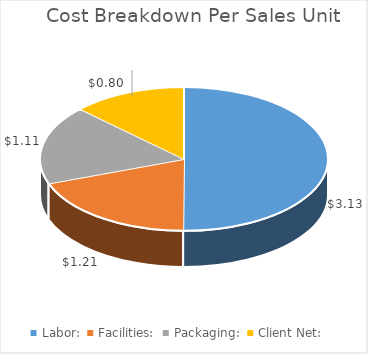
| Category | Client Cost:  |
|---|---|
| Labor:  | 3.134 |
| Facilities:  | 1.212 |
| Packaging:  | 1.111 |
| Client Net:  | 0.8 |